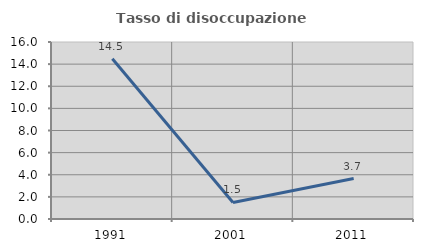
| Category | Tasso di disoccupazione giovanile  |
|---|---|
| 1991.0 | 14.493 |
| 2001.0 | 1.493 |
| 2011.0 | 3.659 |